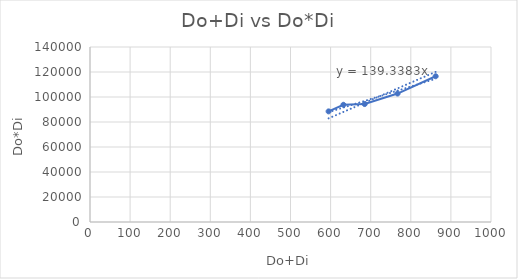
| Category | do*di |
|---|---|
| 595.0 | 88494 |
| 632.0 | 93772 |
| 685.0 | 94354 |
| 767.0 | 102762 |
| 862.0 | 116592 |